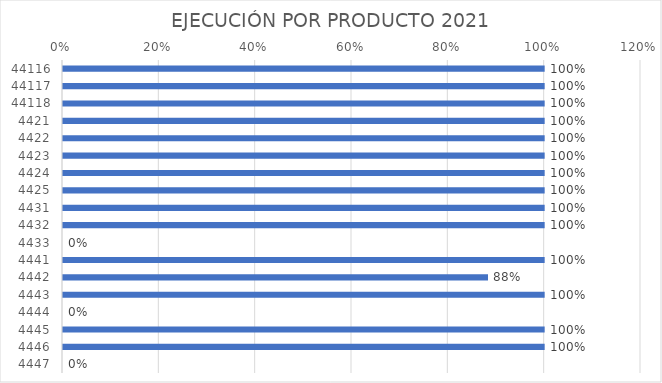
| Category | Series 0 |
|---|---|
| 44116.0 | 1 |
| 44117.0 | 1 |
| 44118.0 | 1 |
| 4421.0 | 1 |
| 4422.0 | 1 |
| 4423.0 | 1 |
| 4424.0 | 1 |
| 4425.0 | 1 |
| 4431.0 | 1 |
| 4432.0 | 1 |
| 4433.0 | 0 |
| 4441.0 | 1 |
| 4442.0 | 0.882 |
| 4443.0 | 1 |
| 4444.0 | 0 |
| 4445.0 | 1 |
| 4446.0 | 1 |
| 4447.0 | 0 |